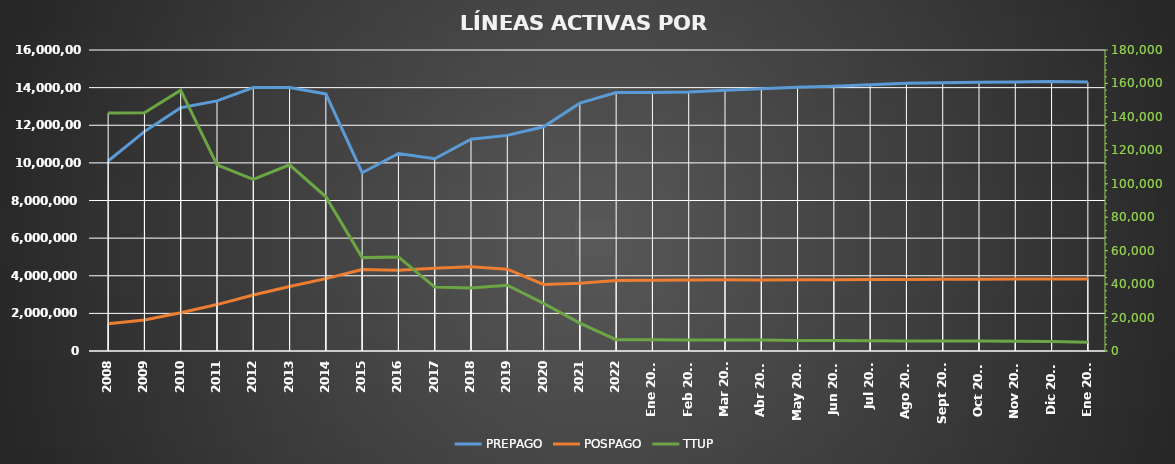
| Category | PREPAGO | POSPAGO |
|---|---|---|
| 2008 | 10097768 | 1452088 |
| 2009 | 11662294 | 1649838 |
| 2010 | 12929040 | 2033814 |
| 2011 | 13295834 | 2467378 |
| 2012 | 14008104 | 2976194 |
| 2013 | 14005126 | 3425277 |
| 2014 | 13666071 | 3846271 |
| 2015 | 9476240 | 4326937 |
| 2016 | 10498467 | 4293426 |
| 2017 | 10219457 | 4393703 |
| 2018 | 11254168 | 4480975 |
| 2019 | 11462048 | 4351686 |
| 2020 | 11917697 | 3539192 |
| 2021 | 13174530 | 3598383 |
| 2022 | 13740159 | 3743849 |
| Ene 2023 | 13744592 | 3762200 |
| Feb 2023 | 13771967 | 3773530 |
| Mar 2023 | 13859395 | 3786936 |
| Abr 2023 | 13944065 | 3768457 |
| May 2023 | 14014722 | 3780848 |
| Jun 2023 | 14075353 | 3791176 |
| Jul 2023 | 14147912 | 3799557 |
| Ago 2023 | 14231611 | 3807034 |
| Sept 2023 | 14265707 | 3810646 |
| Oct 2023 | 14279689 | 3814135 |
| Nov 2023 | 14297382 | 3822228 |
| Dic 2023 | 14330010 | 3829924 |
| Ene 2024 | 14292675 | 3831687 |